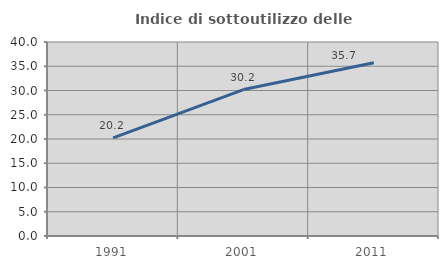
| Category | Indice di sottoutilizzo delle abitazioni  |
|---|---|
| 1991.0 | 20.228 |
| 2001.0 | 30.196 |
| 2011.0 | 35.738 |